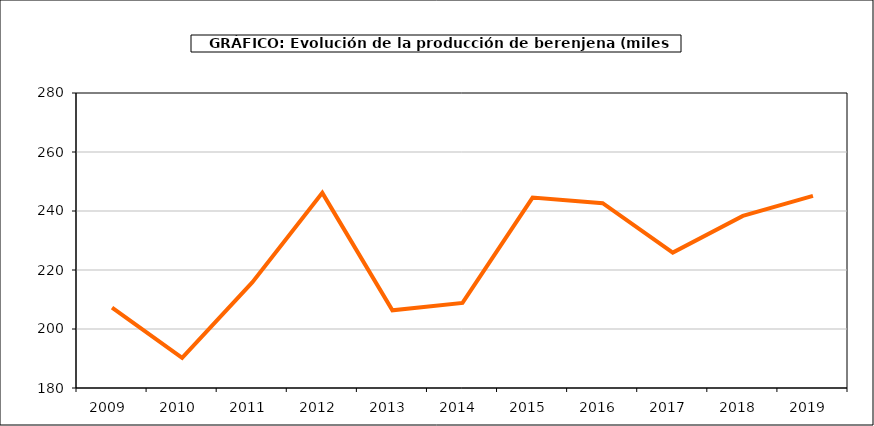
| Category | producción |
|---|---|
| 2009.0 | 207.269 |
| 2010.0 | 190.195 |
| 2011.0 | 215.769 |
| 2012.0 | 246.142 |
| 2013.0 | 206.333 |
| 2014.0 | 208.821 |
| 2015.0 | 244.54 |
| 2016.0 | 242.643 |
| 2017.0 | 225.912 |
| 2018.0 | 238.325 |
| 2019.0 | 245.146 |